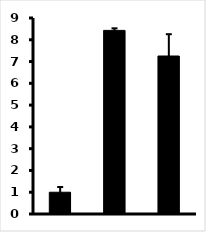
| Category | Series 0 |
|---|---|
| con | 1 |
| Def | 8.431 |
| Res | 7.255 |